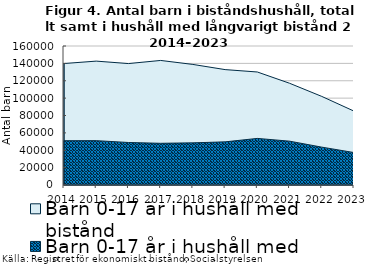
| Category | Barn 0-17 år i hushåll med bistånd | Barn 0-17 år i hushåll med långvarigt bistånd |
|---|---|---|
| 2014.0 | 139805 | 50977 |
| 2015.0 | 142592 | 51057 |
| 2016.0 | 139771 | 48933 |
| 2017.0 | 143376 | 47988 |
| 2018.0 | 138787 | 48514 |
| 2019.0 | 132839 | 49644 |
| 2020.0 | 130076 | 53616 |
| 2021.0 | 117120 | 50465 |
| 2022.0 | 101976 | 43590 |
| 2023.0 | 85039 | 37343 |